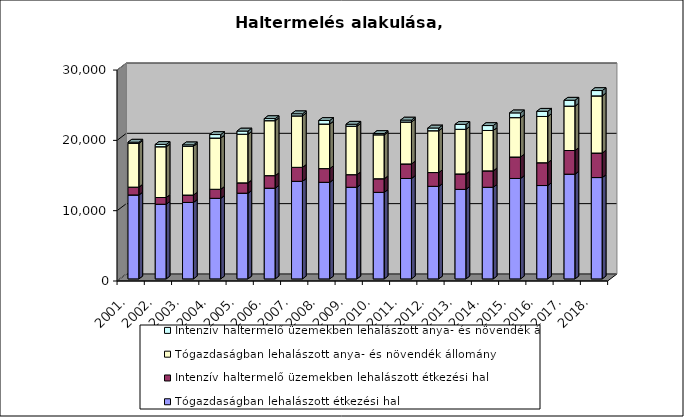
| Category | Tógazdaságban lehalászott étkezési hal | Intenzív haltermelő üzemekben lehalászott étkezési hal | Tógazdaságban lehalászott anya- és növendék állomány | Intenzív haltermelő üzemekben lehalászott anya- és növendék állomány |
|---|---|---|---|---|
| 2001. | 11937.354 | 1113.846 | 6212.995 | 178.151 |
| 2002. | 10614.556 | 958.042 | 7224.781 | 327.099 |
| 2003. | 10874.066 | 1049.933 | 6939.949 | 198.954 |
| 2004. | 11456.996 | 1287.102 | 7286.169 | 496.971 |
| 2005. | 12189.225 | 1470.958 | 6914.118 | 449.767 |
| 2006. | 12897.872 | 1788.909 | 7817.241 | 292.506 |
| 2007. | 13877.581 | 1987.084 | 7320.161 | 295.626 |
| 2008. | 13734.531 | 1952.238 | 6336.224 | 508.302 |
| 2009. | 13026.855 | 1797.93 | 6899.826 | 268.142 |
| 2010. | 12305.627 | 1938.171 | 6253.843 | 176.511 |
| 2011. | 14280.663 | 2066.893 | 5969.885 | 267.764 |
| 2012. | 13162.58 | 1960.862 | 5948.485 | 388.121 |
| 2013. | 12729 | 2196.927 | 6344 | 701.596 |
| 2014. | 13029 | 2335 | 5742 | 700 |
| 2015. | 14282 | 3053.8 | 5601 | 672.2 |
| 2016. | 13278 | 3242 | 6580 | 737 |
| 2017. | 14893.432 | 3364.093 | 6315.146 | 835.443 |
| 2018. | 14413.522 | 3486.877 | 8127.639 | 758.718 |